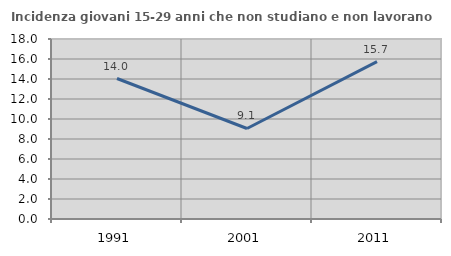
| Category | Incidenza giovani 15-29 anni che non studiano e non lavorano  |
|---|---|
| 1991.0 | 14.05 |
| 2001.0 | 9.052 |
| 2011.0 | 15.73 |